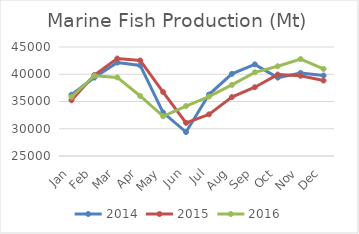
| Category | 2014 | 2015 | 2016 |
|---|---|---|---|
| Jan | 36240 | 35240 | 35860 |
| Feb | 39390 | 39860 | 39730 |
| Mar | 42140 | 42880 | 39420 |
| Apr | 41620 | 42530 | 36010 |
| May | 32970 | 36730 | 32290 |
| Jun | 29390 | 31080 | 34170 |
| Jul | 36280 | 32640 | 35890 |
| Aug | 40070 | 35810 | 38050 |
| Sep | 41810 | 37620 | 40350 |
| Oct | 39380 | 39940 | 41460 |
| Nov | 40240 | 39720 | 42780 |
| Dec | 39770 | 38840 | 40980 |